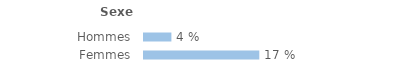
| Category | Series 0 |
|---|---|
| Hommes | 0.041 |
| Femmes | 0.172 |